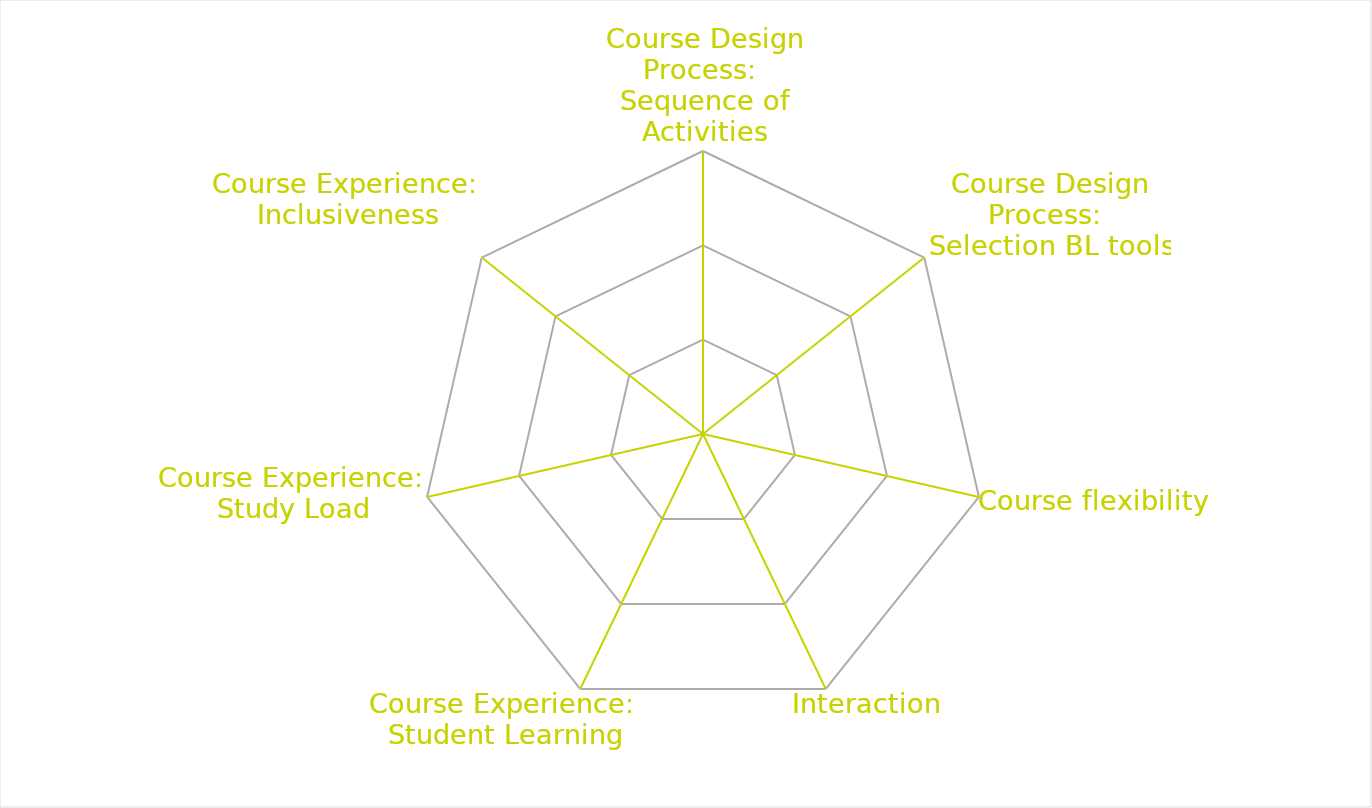
| Category | Series 0 |
|---|---|
| Course Design Process: 
Sequence of Activities | 0 |
| Course Design Process: 
Selection BL tools | 0 |
| Course flexibility | 0 |
| Interaction | 0 |
| Course Experience: 
Student Learning | 0 |
| Course Experience: 
Study Load | 0 |
| Course Experience: 
Inclusiveness | 0 |